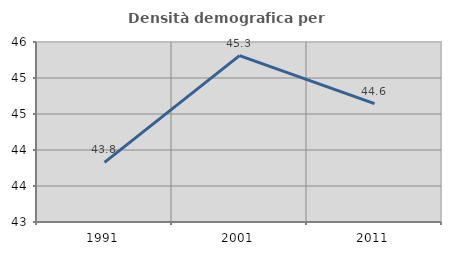
| Category | Densità demografica |
|---|---|
| 1991.0 | 43.829 |
| 2001.0 | 45.31 |
| 2011.0 | 44.644 |